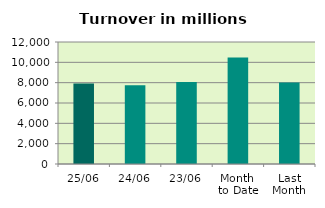
| Category | Series 0 |
|---|---|
| 25/06 | 7929.276 |
| 24/06 | 7737.894 |
| 23/06 | 8071.564 |
| Month 
to Date | 10477.753 |
| Last
Month | 8023.22 |